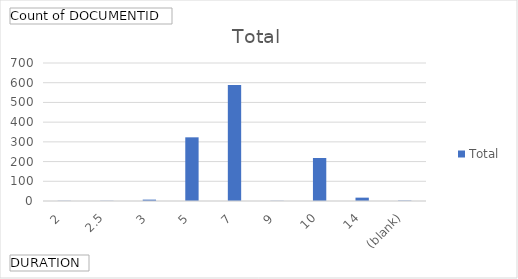
| Category | Total |
|---|---|
| 2 | 1 |
| 2.5 | 1 |
| 3 | 7 |
| 5 | 323 |
| 7 | 588 |
| 9 | 1 |
| 10 | 218 |
| 14 | 17 |
| (blank) | 2 |